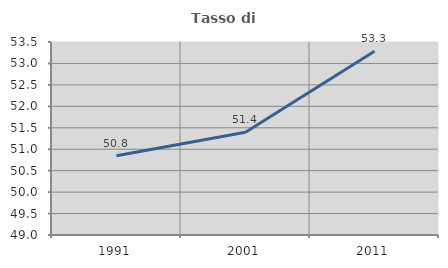
| Category | Tasso di occupazione   |
|---|---|
| 1991.0 | 50.849 |
| 2001.0 | 51.398 |
| 2011.0 | 53.283 |